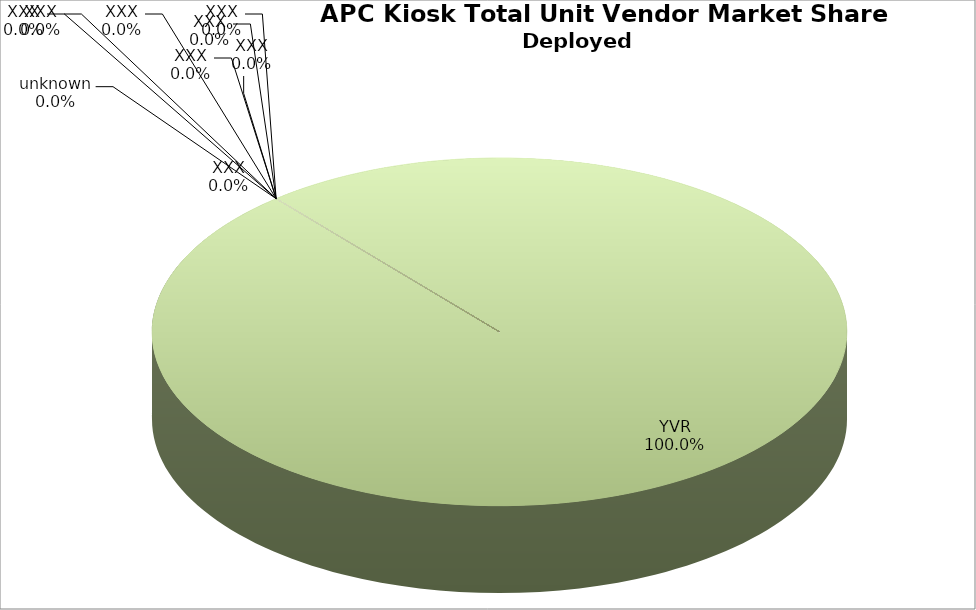
| Category | Deployed |
|---|---|
| YVR | 1 |
| XXX | 0 |
| XXX | 0 |
| XXX | 0 |
| XXX | 0 |
| XXX | 0 |
| XXX | 0 |
| XXX | 0 |
| XXX | 0 |
| unknown | 0 |